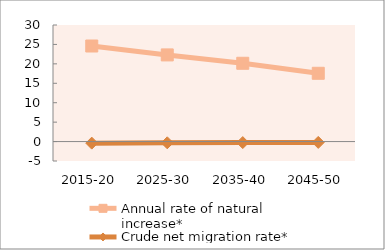
| Category | Annual rate of natural increase* | Crude net migration rate* |
|---|---|---|
| 2015-20 | 24.595 | -0.402 |
| 2025-30 | 22.302 | -0.319 |
| 2035-40 | 20.149 | -0.259 |
| 2045-50 | 17.573 | -0.215 |